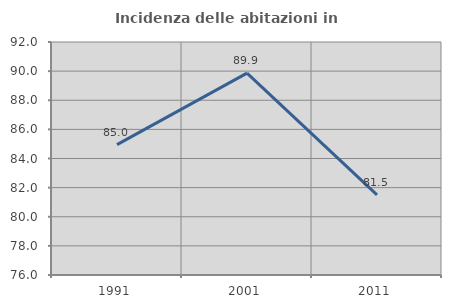
| Category | Incidenza delle abitazioni in proprietà  |
|---|---|
| 1991.0 | 84.953 |
| 2001.0 | 89.863 |
| 2011.0 | 81.5 |